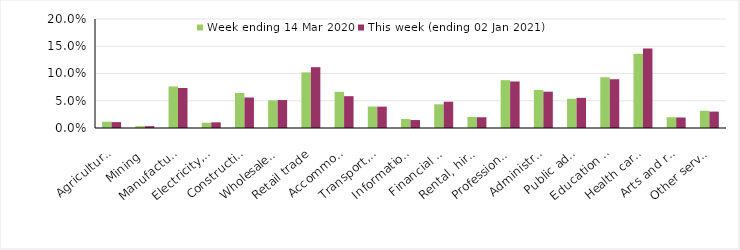
| Category | Week ending 14 Mar 2020 | This week (ending 02 Jan 2021) |
|---|---|---|
| Agriculture, forestry and fishing | 0.012 | 0.011 |
| Mining | 0.003 | 0.003 |
| Manufacturing | 0.076 | 0.073 |
| Electricity, gas, water and waste services | 0.01 | 0.01 |
| Construction | 0.064 | 0.056 |
| Wholesale trade | 0.051 | 0.051 |
| Retail trade | 0.102 | 0.112 |
| Accommodation and food services | 0.066 | 0.058 |
| Transport, postal and warehousing | 0.039 | 0.039 |
| Information media and telecommunications | 0.016 | 0.015 |
| Financial and insurance services | 0.044 | 0.048 |
| Rental, hiring and real estate services | 0.02 | 0.02 |
| Professional, scientific and technical services | 0.088 | 0.085 |
| Administrative and support services | 0.07 | 0.067 |
| Public administration and safety | 0.054 | 0.055 |
| Education and training | 0.093 | 0.09 |
| Health care and social assistance | 0.136 | 0.146 |
| Arts and recreation services | 0.02 | 0.019 |
| Other services | 0.032 | 0.03 |